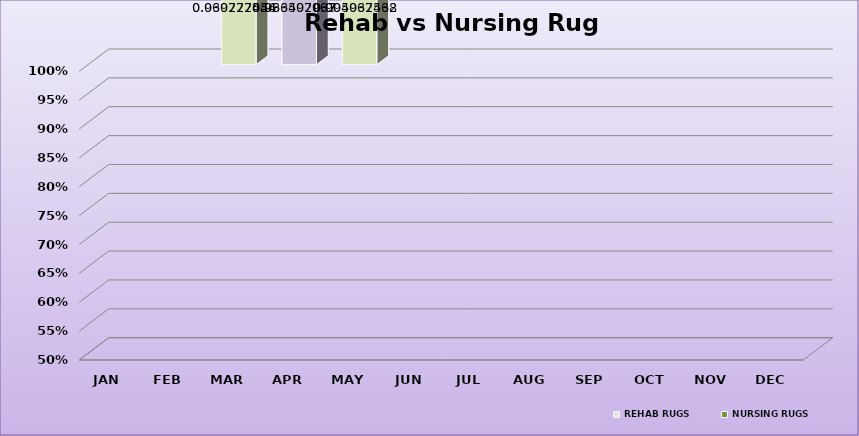
| Category | REHAB RUGS | NURSING RUGS |
|---|---|---|
| 0 | 0 | 0 |
| 1 | 0 | 0 |
| 2 | 0.97 | 0.03 |
| 3 | 0.963 | 0.037 |
| 4 | 0.995 | 0.005 |
| 5 | 0 | 0 |
| 6 | 0 | 0 |
| 7 | 0 | 0 |
| 8 | 0 | 0 |
| 9 | 0 | 0 |
| 10 | 0 | 0 |
| 11 | 0 | 0 |